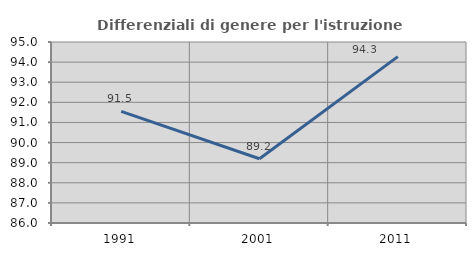
| Category | Differenziali di genere per l'istruzione superiore |
|---|---|
| 1991.0 | 91.547 |
| 2001.0 | 89.197 |
| 2011.0 | 94.272 |